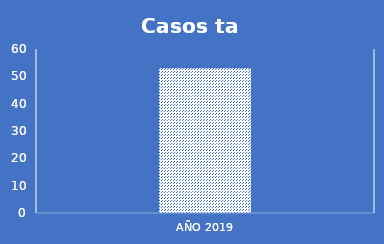
| Category | Series 0 |
|---|---|
| AÑO 2019 | 53 |